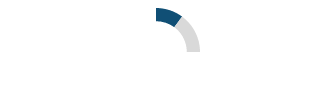
| Category | Series 0 |
|---|---|
| 0 | 0.101 |
| 1 | 0.149 |
| 2 | 0.75 |